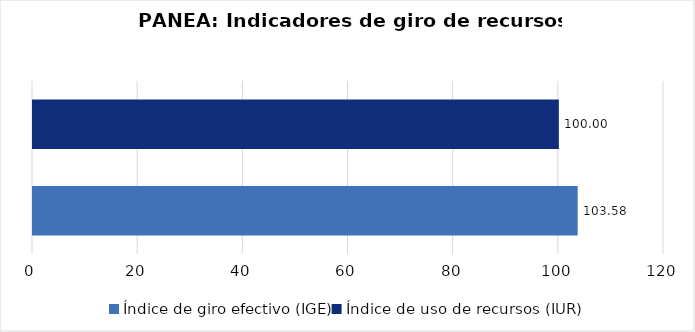
| Category | Series 0 |
|---|---|
| Índice de giro efectivo (IGE) | 103.585 |
| Índice de uso de recursos (IUR)  | 100 |